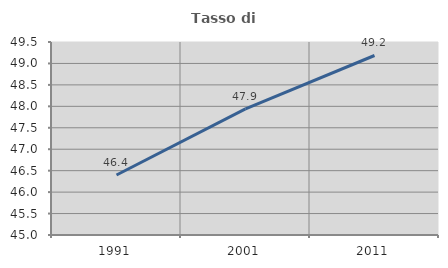
| Category | Tasso di occupazione   |
|---|---|
| 1991.0 | 46.398 |
| 2001.0 | 47.941 |
| 2011.0 | 49.185 |